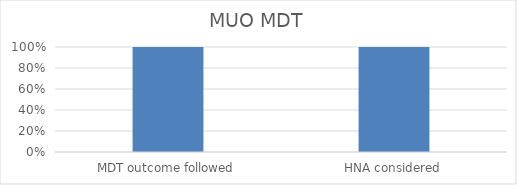
| Category | Series 0 |
|---|---|
| MDT outcome followed | 1 |
| HNA considered | 1 |